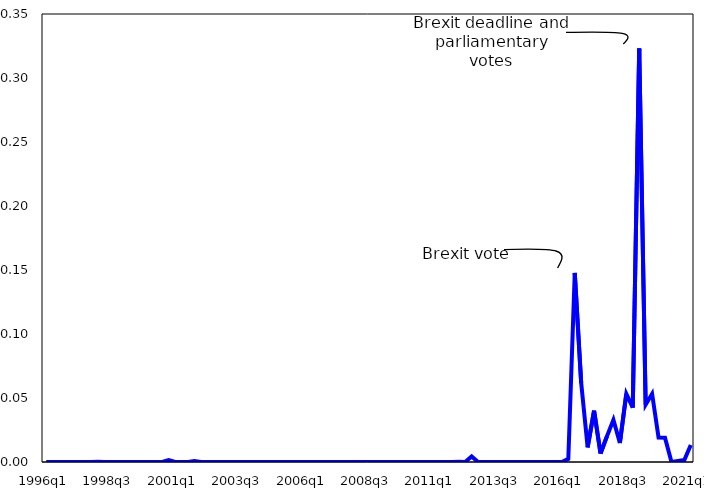
| Category | Series 0 | Series 1 |
|---|---|---|
| 1996q1 | 0 |  |
| 1996q2 | 0 |  |
| 1996q3 | 0 |  |
| 1996q4 | 0 |  |
| 1997q1 | 0 |  |
| 1997q2 | 0 |  |
| 1997q3 | 0 |  |
| 1997q4 | 0 |  |
| 1998q1 | 0 |  |
| 1998q2 | 0 |  |
| 1998q3 | 0 |  |
| 1998q4 | 0 |  |
| 1999q1 | 0 |  |
| 1999q2 | 0 |  |
| 1999q3 | 0 |  |
| 1999q4 | 0 |  |
| 2000q1 | 0 |  |
| 2000q2 | 0 |  |
| 2000q3 | 0 |  |
| 2000q4 | 0.001 |  |
| 2001q1 | 0 |  |
| 2001q2 | 0 |  |
| 2001q3 | 0 |  |
| 2001q4 | 0.001 |  |
| 2002q1 | 0 |  |
| 2002q2 | 0 |  |
| 2002q3 | 0 |  |
| 2002q4 | 0 |  |
| 2003q1 | 0 |  |
| 2003q2 | 0 |  |
| 2003q3 | 0 |  |
| 2003q4 | 0 |  |
| 2004q1 | 0 |  |
| 2004q2 | 0 |  |
| 2004q3 | 0 |  |
| 2004q4 | 0 |  |
| 2005q1 | 0 |  |
| 2005q2 | 0 |  |
| 2005q3 | 0 |  |
| 2005q4 | 0 |  |
| 2006q1 | 0 |  |
| 2006q2 | 0 |  |
| 2006q3 | 0 |  |
| 2006q4 | 0 |  |
| 2007q1 | 0 |  |
| 2007q2 | 0 |  |
| 2007q3 | 0 |  |
| 2007q4 | 0 |  |
| 2008q1 | 0 |  |
| 2008q2 | 0 |  |
| 2008q3 | 0 |  |
| 2008q4 | 0 |  |
| 2009q1 | 0 |  |
| 2009q2 | 0 |  |
| 2009q3 | 0 |  |
| 2009q4 | 0 |  |
| 2010q1 | 0 |  |
| 2010q2 | 0 |  |
| 2010q3 | 0 |  |
| 2010q4 | 0 |  |
| 2011q1 | 0 |  |
| 2011q2 | 0 |  |
| 2011q3 | 0 |  |
| 2011q4 | 0 |  |
| 2012q1 | 0 |  |
| 2012q2 | 0 |  |
| 2012q3 | 0.004 |  |
| 2012q4 | 0 |  |
| 2013q1 | 0 |  |
| 2013q2 | 0 |  |
| 2013q3 | 0 |  |
| 2013q4 | 0 |  |
| 2014q1 | 0 |  |
| 2014q2 | 0 |  |
| 2014q3 | 0 |  |
| 2014q4 | 0 |  |
| 2015q1 | 0 |  |
| 2015q2 | 0 |  |
| 2015q3 | 0 |  |
| 2015q4 | 0 |  |
| 2016q1 | 0 |  |
| 2016q2 | 0.002 |  |
| 2016q3 | 0.148 |  |
| 2016q4 | 0.062 |  |
| 2017q1 | 0.011 |  |
| 2017q2 | 0.04 |  |
| 2017q3 | 0.007 |  |
| 2017q4 | 0.02 |  |
| 2018q1 | 0.033 |  |
| 2018q2 | 0.015 |  |
| 2018q3 | 0.053 |  |
| 2018q4 | 0.042 |  |
| 2019q1 | 0.323 |  |
| 2019q2 | 0.045 |  |
| 2019q3 | 0.053 |  |
| 2019q4 | 0.019 |  |
| 2020q1 | 0.019 |  |
| 2020q2 | 0 |  |
| 2020q3 | 0.001 |  |
| 2020q4 | 0.002 |  |
| 2021q1 | 0.013 |  |